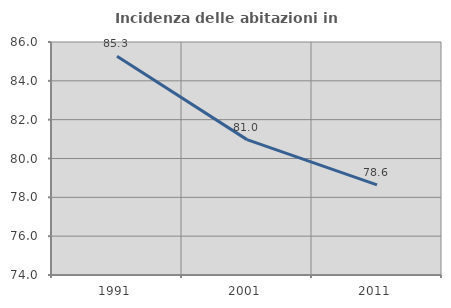
| Category | Incidenza delle abitazioni in proprietà  |
|---|---|
| 1991.0 | 85.271 |
| 2001.0 | 80.972 |
| 2011.0 | 78.644 |